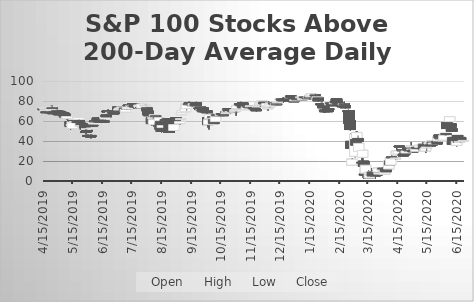
| Category | Open | High | Low | Close |
|---|---|---|---|---|
| 4/15/19 | 72.27 | 72.27 | 72.27 | 72.27 |
| 4/16/19 | 72.27 | 73.26 | 70.29 | 73.26 |
| 4/17/19 | 70.29 | 72.27 | 70.29 | 71.28 |
| 4/18/19 | 69.3 | 71.28 | 69.3 | 69.3 |
| 4/22/19 | 69.3 | 70.29 | 69.3 | 69.3 |
| 4/23/19 | 70.29 | 75.24 | 70.29 | 74.25 |
| 4/24/19 | 73.26 | 75.24 | 72.27 | 72.27 |
| 4/25/19 | 68.31 | 70.29 | 66.33 | 68.31 |
| 4/26/19 | 69.3 | 69.3 | 68.31 | 69.3 |
| 4/29/19 | 70.29 | 71.28 | 68.31 | 68.31 |
| 4/30/19 | 69.3 | 70.29 | 69.3 | 69.3 |
| 5/1/19 | 69.3 | 70.29 | 66.33 | 66.33 |
| 5/2/19 | 67.32 | 68.31 | 66.33 | 66.33 |
| 5/3/19 | 69.3 | 70.29 | 67.32 | 69.3 |
| 5/6/19 | 68.31 | 70.29 | 68.31 | 68.31 |
| 5/7/19 | 67.32 | 67.32 | 64.35 | 64.35 |
| 5/8/19 | 64.35 | 64.35 | 63.36 | 63.36 |
| 5/9/19 | 62.37 | 64.35 | 61.38 | 64.35 |
| 5/10/19 | 62.37 | 64.35 | 59.4 | 64.35 |
| 5/13/19 | 59.4 | 59.4 | 51.48 | 54.45 |
| 5/14/19 | 55.44 | 60.39 | 55.44 | 56.43 |
| 5/15/19 | 52.47 | 59.4 | 52.47 | 59.4 |
| 5/16/19 | 60.39 | 63.36 | 60.39 | 60.39 |
| 5/17/19 | 58.41 | 61.38 | 58.41 | 59.4 |
| 5/20/19 | 59.4 | 61.38 | 57.42 | 59.4 |
| 5/21/19 | 61.38 | 63.36 | 61.38 | 63.36 |
| 5/22/19 | 60.39 | 61.38 | 57.42 | 58.41 |
| 5/23/19 | 54.45 | 56.43 | 51.48 | 55.44 |
| 5/24/19 | 57.42 | 58.41 | 56.43 | 56.43 |
| 5/28/19 | 57.42 | 58.41 | 53.46 | 53.46 |
| 5/29/19 | 49.5 | 51.48 | 46.53 | 48.51 |
| 5/30/19 | 50.49 | 51.48 | 49.5 | 49.5 |
| 5/31/19 | 45.54 | 46.53 | 44.55 | 45.54 |
| 6/3/19 | 45.54 | 46.53 | 42.57 | 44 |
| 6/4/19 | 52 | 53 | 49 | 53 |
| 6/5/19 | 56 | 57 | 54 | 56 |
| 6/6/19 | 57 | 60 | 57 | 59 |
| 6/7/19 | 60 | 63 | 60 | 60 |
| 6/10/19 | 63 | 64 | 61 | 61 |
| 6/11/19 | 62 | 63 | 59 | 59 |
| 6/12/19 | 60 | 60 | 59 | 60 |
| 6/13/19 | 60 | 61 | 59 | 59 |
| 6/14/19 | 60 | 60 | 59 | 60 |
| 6/17/19 | 60 | 60 | 59 | 60 |
| 6/18/19 | 62 | 65 | 61 | 64 |
| 6/19/19 | 66 | 67 | 64 | 64 |
| 6/20/19 | 70 | 70 | 65 | 69 |
| 6/21/19 | 70 | 72 | 68 | 69 |
| 6/24/19 | 68 | 70 | 68 | 69 |
| 6/25/19 | 70 | 71 | 69 | 70 |
| 6/26/19 | 69 | 70 | 68 | 68 |
| 6/27/19 | 68 | 69 | 67 | 67 |
| 6/28/19 | 70 | 72 | 70 | 70 |
| 7/1/19 | 74 | 74 | 69 | 71 |
| 7/2/19 | 71 | 72 | 71 | 72 |
| 7/3/19 | 72 | 74 | 72 | 73 |
| 7/5/19 | 73 | 74 | 72 | 74 |
| 7/8/19 | 73 | 73 | 70 | 70 |
| 7/9/19 | 69 | 73 | 69 | 72 |
| 7/10/19 | 73 | 73 | 71 | 72 |
| 7/11/19 | 72 | 75 | 72 | 74 |
| 7/12/19 | 76 | 76 | 74 | 76 |
| 7/15/19 | 74 | 76 | 74 | 76 |
| 7/16/19 | 77 | 77 | 74 | 75 |
| 7/17/19 | 75 | 76 | 75 | 76 |
| 7/18/19 | 77 | 77 | 72 | 74 |
| 7/19/19 | 76 | 76 | 74 | 74 |
| 7/22/19 | 74 | 74 | 73 | 74 |
| 7/23/19 | 74 | 76 | 74 | 76 |
| 7/24/19 | 73 | 75 | 72 | 74 |
| 7/25/19 | 74 | 74 | 73 | 74 |
| 7/26/19 | 73 | 77 | 73 | 77 |
| 7/29/19 | 76 | 77 | 75 | 76.23 |
| 7/30/19 | 74.25 | 76.23 | 73.26 | 75.24 |
| 7/31/19 | 73.26 | 74.25 | 70.29 | 70.29 |
| 8/1/19 | 70.29 | 73.26 | 66.33 | 66.33 |
| 8/2/19 | 66.33 | 67.32 | 64.35 | 66.33 |
| 8/5/19 | 63.36 | 63.36 | 55.44 | 57.42 |
| 8/6/19 | 62.37 | 64.35 | 58.41 | 63.36 |
| 8/7/19 | 56.43 | 62.37 | 54.45 | 61.38 |
| 8/8/19 | 64.35 | 66.33 | 63.36 | 66.33 |
| 8/9/19 | 65.34 | 65.34 | 62.37 | 65.34 |
| 8/12/19 | 63.36 | 63.36 | 60.39 | 62.37 |
| 8/13/19 | 60.39 | 65.34 | 60.39 | 63.36 |
| 8/14/19 | 59.4 | 59.4 | 51.48 | 51.48 |
| 8/15/19 | 50.49 | 52.47 | 48.51 | 50.49 |
| 8/16/19 | 53.46 | 56.43 | 53.46 | 55.44 |
| 8/19/19 | 61.38 | 62.37 | 59.4 | 60.39 |
| 8/20/19 | 58.41 | 60.39 | 56.43 | 56.43 |
| 8/21/19 | 62.37 | 62.37 | 61.38 | 62.37 |
| 8/22/19 | 62.37 | 62.37 | 61.38 | 61.38 |
| 8/23/19 | 59.4 | 62.37 | 48.51 | 48.51 |
| 8/26/19 | 53.46 | 53.46 | 49.5 | 52.47 |
| 8/27/19 | 55.44 | 55.44 | 50.49 | 52.47 |
| 8/28/19 | 50.49 | 56.43 | 50.49 | 56.43 |
| 8/29/19 | 61.38 | 61.38 | 59.4 | 59.4 |
| 8/30/19 | 63.36 | 63.36 | 60.39 | 61.38 |
| 9/3/19 | 57.42 | 59.4 | 56.43 | 59.4 |
| 9/4/19 | 61.38 | 63.36 | 61.38 | 62.37 |
| 9/5/19 | 66.33 | 73.26 | 66.33 | 68.31 |
| 9/6/19 | 68.31 | 70.29 | 68.31 | 70.29 |
| 9/9/19 | 69.3 | 74.25 | 69.3 | 73.26 |
| 9/10/19 | 72.27 | 77.22 | 70.29 | 77.22 |
| 9/11/19 | 76.23 | 77.22 | 75.24 | 77.22 |
| 9/12/19 | 77.22 | 79.2 | 76.23 | 77.22 |
| 9/13/19 | 78.21 | 79.2 | 77.22 | 78.21 |
| 9/16/19 | 76.23 | 78.21 | 74.25 | 76.23 |
| 9/17/19 | 75.24 | 78.21 | 72.27 | 77.22 |
| 9/18/19 | 75.24 | 76.23 | 72.27 | 76.23 |
| 9/19/19 | 77.22 | 78.21 | 74.25 | 75.24 |
| 9/20/19 | 78.21 | 79.2 | 75.24 | 75.24 |
| 9/23/19 | 73.26 | 74.25 | 72.27 | 74.25 |
| 9/24/19 | 74.25 | 74.25 | 69.3 | 71.28 |
| 9/25/19 | 70.29 | 71.28 | 68.31 | 71.28 |
| 9/26/19 | 71.28 | 71.28 | 69.3 | 70.29 |
| 9/27/19 | 73.26 | 73.26 | 68.31 | 69.3 |
| 9/30/19 | 70.29 | 70.29 | 69.3 | 69.3 |
| 10/1/19 | 70.29 | 70.29 | 67.32 | 68.31 |
| 10/2/19 | 63.36 | 63.36 | 53.46 | 56.43 |
| 10/3/19 | 56.43 | 61.38 | 51.48 | 61.38 |
| 10/4/19 | 62.37 | 66.33 | 60.39 | 66.33 |
| 10/7/19 | 64.35 | 67.32 | 64.35 | 64.35 |
| 10/8/19 | 61.38 | 61.38 | 57.42 | 57.42 |
| 10/9/19 | 60.39 | 61.38 | 58.41 | 60.39 |
| 10/10/19 | 59.4 | 66.33 | 59.4 | 64.35 |
| 10/11/19 | 66.33 | 67.32 | 66.33 | 66.33 |
| 10/14/19 | 66.33 | 66.33 | 65.34 | 65.34 |
| 10/15/19 | 65.34 | 69.3 | 64.35 | 67.32 |
| 10/16/19 | 67.32 | 69.3 | 66.33 | 66.33 |
| 10/17/19 | 67.32 | 69.3 | 66.33 | 66.33 |
| 10/18/19 | 66.33 | 68.31 | 65.34 | 66.33 |
| 10/21/19 | 67.32 | 70.29 | 66.33 | 68.31 |
| 10/22/19 | 69.3 | 72.27 | 69.3 | 71.28 |
| 10/23/19 | 72.27 | 72.27 | 69.3 | 70.29 |
| 10/24/19 | 71.28 | 72.27 | 68.31 | 69.3 |
| 10/25/19 | 68.31 | 70.29 | 67.32 | 69.3 |
| 10/28/19 | 70.29 | 70.29 | 69.3 | 70.29 |
| 10/29/19 | 71.28 | 72.27 | 70.29 | 70.29 |
| 10/30/19 | 69.3 | 73.26 | 68.31 | 71.28 |
| 10/31/19 | 70.29 | 71.28 | 65.34 | 71.28 |
| 11/1/19 | 72.27 | 76.23 | 72.27 | 75.24 |
| 11/4/19 | 77.22 | 77.22 | 76.23 | 77.22 |
| 11/5/19 | 76.23 | 79.2 | 75.24 | 76.23 |
| 11/6/19 | 77.22 | 78.21 | 76.23 | 77.22 |
| 11/7/19 | 78.21 | 78.21 | 73.26 | 73.26 |
| 11/8/19 | 74.25 | 75.24 | 72.27 | 73.26 |
| 11/11/19 | 71.28 | 75.24 | 71.28 | 74.25 |
| 11/12/19 | 75.24 | 76.23 | 73.26 | 75.24 |
| 11/13/19 | 74.25 | 75.24 | 74.25 | 74.25 |
| 11/14/19 | 74.25 | 74.25 | 73.26 | 73.26 |
| 11/15/19 | 74.25 | 75.24 | 73.26 | 75.24 |
| 11/18/19 | 73.26 | 74.25 | 72.27 | 73.26 |
| 11/19/19 | 73.26 | 75.24 | 71.28 | 72.27 |
| 11/20/19 | 72.27 | 74.25 | 70.29 | 72.27 |
| 11/21/19 | 71.28 | 72.27 | 69.3 | 70.29 |
| 11/22/19 | 74.25 | 76.23 | 73.26 | 75 |
| 11/25/19 | 76 | 78 | 74 | 78 |
| 11/26/19 | 76 | 78 | 76 | 77 |
| 11/27/19 | 79 | 80 | 78 | 80 |
| 11/29/19 | 79 | 79 | 77 | 77 |
| 12/2/19 | 75 | 77.45 | 74 | 77.45 |
| 12/3/19 | 72.27 | 73.26 | 70.29 | 73.26 |
| 12/4/19 | 74.25 | 77.22 | 74.25 | 75.24 |
| 12/5/19 | 74.25 | 76.23 | 73.26 | 76.23 |
| 12/6/19 | 77.22 | 78.21 | 77.22 | 78.21 |
| 12/9/19 | 78.21 | 78.21 | 77.22 | 77.22 |
| 12/10/19 | 77.22 | 77.22 | 76.23 | 76.23 |
| 12/11/19 | 76.23 | 77.22 | 75.24 | 77.22 |
| 12/12/19 | 77.22 | 78.21 | 77.22 | 77.22 |
| 12/13/19 | 78.21 | 80.19 | 76.23 | 79.2 |
| 12/16/19 | 81.18 | 82.17 | 80.19 | 82.17 |
| 12/17/19 | 82.17 | 82.17 | 80.19 | 81.18 |
| 12/18/19 | 81.18 | 82.17 | 81.18 | 81.18 |
| 12/19/19 | 81.18 | 82.17 | 78.21 | 80.19 |
| 12/20/19 | 82.17 | 83.16 | 81.18 | 82.17 |
| 12/23/19 | 82.17 | 83.16 | 82.17 | 82.17 |
| 12/24/19 | 83.16 | 84.15 | 81.18 | 83.16 |
| 12/26/19 | 83.16 | 84.15 | 83.16 | 84.15 |
| 12/27/19 | 85.14 | 85.14 | 82.17 | 83.16 |
| 12/30/19 | 83.16 | 83.16 | 79.2 | 79.2 |
| 12/31/19 | 80.19 | 81.18 | 79.2 | 81.18 |
| 1/2/20 | 82.17 | 83.16 | 81.18 | 82.17 |
| 1/3/20 | 83.16 | 83.16 | 82.17 | 83.16 |
| 1/6/20 | 83.16 | 84.15 | 83.16 | 84.15 |
| 1/7/20 | 82.17 | 82.17 | 81.18 | 81.18 |
| 1/8/20 | 81.18 | 84.15 | 81.18 | 84.15 |
| 1/9/20 | 82.17 | 84.15 | 82.17 | 83.16 |
| 1/10/20 | 84.15 | 85.14 | 83.16 | 83.16 |
| 1/13/20 | 83.16 | 84.15 | 83.16 | 83.16 |
| 1/14/20 | 83.16 | 85.14 | 83.16 | 84.15 |
| 1/15/20 | 84.15 | 84.15 | 82.17 | 83.16 |
| 1/16/20 | 84.15 | 86.13 | 83.16 | 86.13 |
| 1/17/20 | 85.14 | 87.12 | 83.16 | 87.12 |
| 1/21/20 | 86.13 | 87.12 | 83.16 | 85.14 |
| 1/22/20 | 84.15 | 85.14 | 83.16 | 83.16 |
| 1/23/20 | 81.18 | 84.15 | 80.19 | 84.15 |
| 1/24/20 | 83.16 | 83.16 | 79.2 | 80.19 |
| 1/27/20 | 77.22 | 78.21 | 76.23 | 77.22 |
| 1/28/20 | 77.22 | 78.21 | 76.23 | 76.23 |
| 1/29/20 | 75.24 | 75.24 | 73.26 | 73.26 |
| 1/30/20 | 70.29 | 71.28 | 68.31 | 71.28 |
| 1/31/20 | 71.28 | 72.27 | 68.31 | 69.3 |
| 2/3/20 | 72.27 | 72.27 | 69.3 | 69.3 |
| 2/4/20 | 72.27 | 75.24 | 72.27 | 72.27 |
| 2/5/20 | 76.23 | 79.2 | 76.23 | 78.21 |
| 2/6/20 | 78.21 | 79.2 | 76.23 | 77.22 |
| 2/7/20 | 77.22 | 78.21 | 75.24 | 75.24 |
| 2/10/20 | 77.22 | 78.21 | 76.23 | 78.21 |
| 2/11/20 | 79.2 | 80.19 | 78.21 | 78.21 |
| 2/12/20 | 82.17 | 82.17 | 79.2 | 79.2 |
| 2/13/20 | 79.2 | 79.2 | 76.23 | 77.22 |
| 2/14/20 | 77.22 | 77.22 | 75.24 | 76.23 |
| 2/18/20 | 75.24 | 76.23 | 74.25 | 75.24 |
| 2/19/20 | 76.23 | 77.22 | 76.23 | 77.22 |
| 2/20/20 | 77.22 | 79.2 | 76.23 | 76.23 |
| 2/21/20 | 75.24 | 76.23 | 72.27 | 73.26 |
| 2/24/20 | 70.29 | 71.28 | 69.3 | 69.3 |
| 2/25/20 | 70.29 | 70.29 | 56.43 | 57.42 |
| 2/26/20 | 60.39 | 61.38 | 50.49 | 51.48 |
| 2/27/20 | 39.6 | 47.52 | 32.67 | 32.67 |
| 2/28/20 | 15.84 | 22.77 | 15.84 | 21.78 |
| 3/2/20 | 24.75 | 46.53 | 23.76 | 46.53 |
| 3/3/20 | 41.58 | 49.5 | 32.67 | 35.64 |
| 3/4/20 | 42.57 | 49.5 | 42.57 | 48.51 |
| 3/5/20 | 42.57 | 45.54 | 37.62 | 39.6 |
| 3/6/20 | 29.7 | 38.61 | 25.74 | 37.62 |
| 3/9/20 | 18.81 | 22.77 | 17.82 | 17.82 |
| 3/10/20 | 23.76 | 30.69 | 15.84 | 30.69 |
| 3/11/20 | 19.8 | 19.8 | 13.86 | 14.85 |
| 3/12/20 | 6.93 | 12.87 | 5.94 | 5.94 |
| 3/13/20 | 7.92 | 15.84 | 6.93 | 15.84 |
| 3/16/20 | 6.93 | 10.89 | 2.97 | 2.97 |
| 3/17/20 | 2.97 | 9.9 | 2.97 | 8.91 |
| 3/18/20 | 5.94 | 9.9 | 4.95 | 6.93 |
| 3/19/20 | 4.95 | 12.87 | 4.95 | 8.91 |
| 3/20/20 | 8.91 | 10.89 | 4.95 | 4.95 |
| 3/23/20 | 5.94 | 7.92 | 1.98 | 5.94 |
| 3/24/20 | 7.92 | 8.91 | 4.95 | 7.92 |
| 3/25/20 | 7.92 | 8.91 | 4.95 | 5.94 |
| 3/26/20 | 8.91 | 12.87 | 7.92 | 12.87 |
| 3/27/20 | 6.93 | 11.88 | 6.93 | 7.92 |
| 3/30/20 | 10.89 | 13.86 | 9.9 | 12.87 |
| 3/31/20 | 12.87 | 13.86 | 10.89 | 11.88 |
| 4/1/20 | 6.93 | 8.91 | 6.93 | 7.92 |
| 4/2/20 | 6.93 | 9.9 | 6.93 | 9.9 |
| 4/3/20 | 11.88 | 11.88 | 8.91 | 9 |
| 4/6/20 | 12 | 20 | 12 | 20 |
| 4/7/20 | 20 | 22 | 16 | 16 |
| 4/8/20 | 16 | 24 | 16 | 23 |
| 4/9/20 | 24 | 27 | 23 | 24 |
| 4/13/20 | 22 | 23 | 21 | 23 |
| 4/14/20 | 26 | 33 | 26 | 30 |
| 4/15/20 | 26 | 29 | 25 | 27 |
| 4/16/20 | 27 | 30 | 25 | 30 |
| 4/17/20 | 35 | 35 | 33 | 35 |
| 4/20/20 | 31 | 36 | 31 | 31 |
| 4/21/20 | 27 | 28 | 24 | 25 |
| 4/22/20 | 27 | 29 | 26 | 27 |
| 4/23/20 | 30 | 32 | 26 | 27 |
| 4/24/20 | 28 | 31 | 28 | 30 |
| 4/27/20 | 33 | 34 | 29 | 30 |
| 4/28/20 | 32 | 32 | 30 | 31 |
| 4/29/20 | 34 | 39 | 33 | 35 |
| 4/30/20 | 31 | 34 | 31 | 32 |
| 5/1/20 | 31 | 31 | 29 | 29 |
| 5/4/20 | 29.7 | 31.68 | 29.7 | 31.68 |
| 5/5/20 | 33.66 | 34.65 | 33.66 | 33.66 |
| 5/6/20 | 33.66 | 34.65 | 32.67 | 32.67 |
| 5/7/20 | 33.66 | 33.66 | 33.66 | 33.66 |
| 5/8/20 | 33.66 | 36.63 | 33.66 | 35.64 |
| 5/11/20 | 34.65 | 38.61 | 34.65 | 36.63 |
| 5/12/20 | 36.63 | 36.63 | 31 | 31 |
| 5/13/20 | 31 | 33 | 31 | 32 |
| 5/14/20 | 30 | 33 | 28 | 33 |
| 5/15/20 | 33 | 35 | 30 | 34 |
| 5/18/20 | 37 | 40 | 37 | 38 |
| 5/19/20 | 36 | 37 | 35 | 35 |
| 5/20/20 | 38 | 40 | 38 | 40 |
| 5/21/20 | 39 | 39 | 35 | 36 |
| 5/22/20 | 37 | 38 | 37 | 38 |
| 5/26/20 | 40 | 41 | 37 | 37 |
| 5/27/20 | 40 | 45 | 40 | 45 |
| 5/28/20 | 46 | 46 | 43 | 43 |
| 5/29/20 | 43 | 43 | 41 | 43 |
| 6/1/20 | 40 | 42 | 40 | 41 |
| 6/2/20 | 41 | 45.54 | 41 | 45.54 |
| 6/3/20 | 46.53 | 47.52 | 45.54 | 47.52 |
| 6/4/20 | 47.52 | 47.52 | 45.54 | 47.52 |
| 6/5/20 | 58.41 | 60.39 | 52.47 | 52.47 |
| 6/8/20 | 59.4 | 64.35 | 59.4 | 64.35 |
| 6/9/20 | 57.42 | 58.41 | 52.47 | 53.46 |
| 6/10/20 | 52.47 | 53.46 | 49.5 | 49.5 |
| 6/11/20 | 43.56 | 44.55 | 36.63 | 36.63 |
| 6/12/20 | 41.58 | 41.58 | 35.64 | 36.63 |
| 6/15/20 | 35.64 | 40.59 | 34.65 | 39.6 |
| 6/16/20 | 45.54 | 45.54 | 39.6 | 44.55 |
| 6/17/20 | 43.56 | 43.56 | 38.61 | 38.61 |
| 6/18/20 | 38.61 | 39.6 | 38.61 | 39.6 |
| 6/19/20 | 43.56 | 45.54 | 38.61 | 40.59 |
| 6/22/20 | 39.6 | 41.58 | 39.6 | 40.59 |